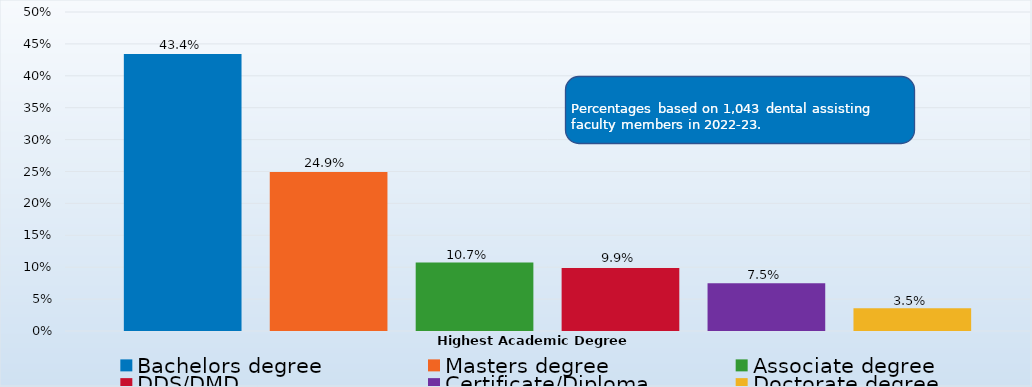
| Category | Bachelors degree | Masters degree | Associate degree | DDS/DMD | Certificate/Diploma | Doctorate degree |
|---|---|---|---|---|---|---|
| Percent | 0.434 | 0.249 | 0.107 | 0.099 | 0.075 | 0.035 |